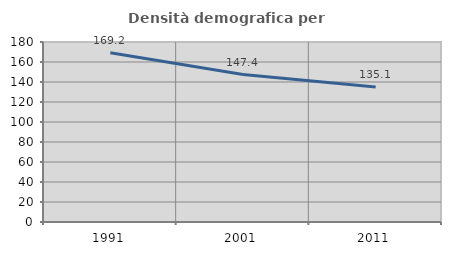
| Category | Densità demografica |
|---|---|
| 1991.0 | 169.22 |
| 2001.0 | 147.403 |
| 2011.0 | 135.083 |